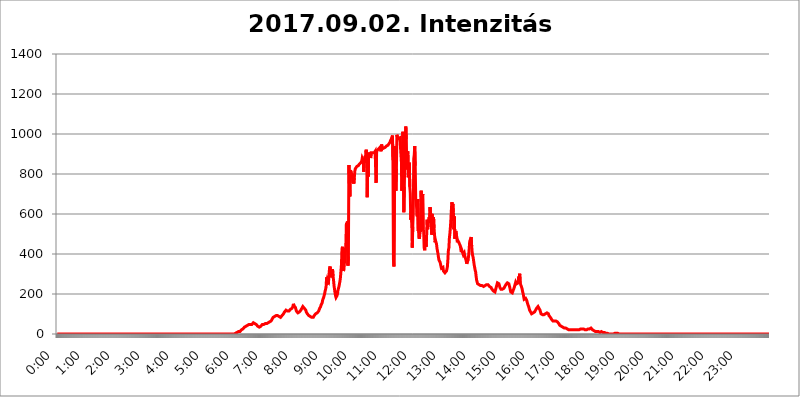
| Category | 2017.09.02. Intenzitás [W/m^2] |
|---|---|
| 0.0 | 0 |
| 0.0006944444444444445 | 0 |
| 0.001388888888888889 | 0 |
| 0.0020833333333333333 | 0 |
| 0.002777777777777778 | 0 |
| 0.003472222222222222 | 0 |
| 0.004166666666666667 | 0 |
| 0.004861111111111111 | 0 |
| 0.005555555555555556 | 0 |
| 0.0062499999999999995 | 0 |
| 0.006944444444444444 | 0 |
| 0.007638888888888889 | 0 |
| 0.008333333333333333 | 0 |
| 0.009027777777777779 | 0 |
| 0.009722222222222222 | 0 |
| 0.010416666666666666 | 0 |
| 0.011111111111111112 | 0 |
| 0.011805555555555555 | 0 |
| 0.012499999999999999 | 0 |
| 0.013194444444444444 | 0 |
| 0.013888888888888888 | 0 |
| 0.014583333333333332 | 0 |
| 0.015277777777777777 | 0 |
| 0.015972222222222224 | 0 |
| 0.016666666666666666 | 0 |
| 0.017361111111111112 | 0 |
| 0.018055555555555557 | 0 |
| 0.01875 | 0 |
| 0.019444444444444445 | 0 |
| 0.02013888888888889 | 0 |
| 0.020833333333333332 | 0 |
| 0.02152777777777778 | 0 |
| 0.022222222222222223 | 0 |
| 0.02291666666666667 | 0 |
| 0.02361111111111111 | 0 |
| 0.024305555555555556 | 0 |
| 0.024999999999999998 | 0 |
| 0.025694444444444447 | 0 |
| 0.02638888888888889 | 0 |
| 0.027083333333333334 | 0 |
| 0.027777777777777776 | 0 |
| 0.02847222222222222 | 0 |
| 0.029166666666666664 | 0 |
| 0.029861111111111113 | 0 |
| 0.030555555555555555 | 0 |
| 0.03125 | 0 |
| 0.03194444444444445 | 0 |
| 0.03263888888888889 | 0 |
| 0.03333333333333333 | 0 |
| 0.034027777777777775 | 0 |
| 0.034722222222222224 | 0 |
| 0.035416666666666666 | 0 |
| 0.036111111111111115 | 0 |
| 0.03680555555555556 | 0 |
| 0.0375 | 0 |
| 0.03819444444444444 | 0 |
| 0.03888888888888889 | 0 |
| 0.03958333333333333 | 0 |
| 0.04027777777777778 | 0 |
| 0.04097222222222222 | 0 |
| 0.041666666666666664 | 0 |
| 0.042361111111111106 | 0 |
| 0.04305555555555556 | 0 |
| 0.043750000000000004 | 0 |
| 0.044444444444444446 | 0 |
| 0.04513888888888889 | 0 |
| 0.04583333333333334 | 0 |
| 0.04652777777777778 | 0 |
| 0.04722222222222222 | 0 |
| 0.04791666666666666 | 0 |
| 0.04861111111111111 | 0 |
| 0.049305555555555554 | 0 |
| 0.049999999999999996 | 0 |
| 0.05069444444444445 | 0 |
| 0.051388888888888894 | 0 |
| 0.052083333333333336 | 0 |
| 0.05277777777777778 | 0 |
| 0.05347222222222222 | 0 |
| 0.05416666666666667 | 0 |
| 0.05486111111111111 | 0 |
| 0.05555555555555555 | 0 |
| 0.05625 | 0 |
| 0.05694444444444444 | 0 |
| 0.057638888888888885 | 0 |
| 0.05833333333333333 | 0 |
| 0.05902777777777778 | 0 |
| 0.059722222222222225 | 0 |
| 0.06041666666666667 | 0 |
| 0.061111111111111116 | 0 |
| 0.06180555555555556 | 0 |
| 0.0625 | 0 |
| 0.06319444444444444 | 0 |
| 0.06388888888888888 | 0 |
| 0.06458333333333334 | 0 |
| 0.06527777777777778 | 0 |
| 0.06597222222222222 | 0 |
| 0.06666666666666667 | 0 |
| 0.06736111111111111 | 0 |
| 0.06805555555555555 | 0 |
| 0.06874999999999999 | 0 |
| 0.06944444444444443 | 0 |
| 0.07013888888888889 | 0 |
| 0.07083333333333333 | 0 |
| 0.07152777777777779 | 0 |
| 0.07222222222222223 | 0 |
| 0.07291666666666667 | 0 |
| 0.07361111111111111 | 0 |
| 0.07430555555555556 | 0 |
| 0.075 | 0 |
| 0.07569444444444444 | 0 |
| 0.0763888888888889 | 0 |
| 0.07708333333333334 | 0 |
| 0.07777777777777778 | 0 |
| 0.07847222222222222 | 0 |
| 0.07916666666666666 | 0 |
| 0.0798611111111111 | 0 |
| 0.08055555555555556 | 0 |
| 0.08125 | 0 |
| 0.08194444444444444 | 0 |
| 0.08263888888888889 | 0 |
| 0.08333333333333333 | 0 |
| 0.08402777777777777 | 0 |
| 0.08472222222222221 | 0 |
| 0.08541666666666665 | 0 |
| 0.08611111111111112 | 0 |
| 0.08680555555555557 | 0 |
| 0.08750000000000001 | 0 |
| 0.08819444444444445 | 0 |
| 0.08888888888888889 | 0 |
| 0.08958333333333333 | 0 |
| 0.09027777777777778 | 0 |
| 0.09097222222222222 | 0 |
| 0.09166666666666667 | 0 |
| 0.09236111111111112 | 0 |
| 0.09305555555555556 | 0 |
| 0.09375 | 0 |
| 0.09444444444444444 | 0 |
| 0.09513888888888888 | 0 |
| 0.09583333333333333 | 0 |
| 0.09652777777777777 | 0 |
| 0.09722222222222222 | 0 |
| 0.09791666666666667 | 0 |
| 0.09861111111111111 | 0 |
| 0.09930555555555555 | 0 |
| 0.09999999999999999 | 0 |
| 0.10069444444444443 | 0 |
| 0.1013888888888889 | 0 |
| 0.10208333333333335 | 0 |
| 0.10277777777777779 | 0 |
| 0.10347222222222223 | 0 |
| 0.10416666666666667 | 0 |
| 0.10486111111111111 | 0 |
| 0.10555555555555556 | 0 |
| 0.10625 | 0 |
| 0.10694444444444444 | 0 |
| 0.1076388888888889 | 0 |
| 0.10833333333333334 | 0 |
| 0.10902777777777778 | 0 |
| 0.10972222222222222 | 0 |
| 0.1111111111111111 | 0 |
| 0.11180555555555556 | 0 |
| 0.11180555555555556 | 0 |
| 0.1125 | 0 |
| 0.11319444444444444 | 0 |
| 0.11388888888888889 | 0 |
| 0.11458333333333333 | 0 |
| 0.11527777777777777 | 0 |
| 0.11597222222222221 | 0 |
| 0.11666666666666665 | 0 |
| 0.1173611111111111 | 0 |
| 0.11805555555555557 | 0 |
| 0.11944444444444445 | 0 |
| 0.12013888888888889 | 0 |
| 0.12083333333333333 | 0 |
| 0.12152777777777778 | 0 |
| 0.12222222222222223 | 0 |
| 0.12291666666666667 | 0 |
| 0.12291666666666667 | 0 |
| 0.12361111111111112 | 0 |
| 0.12430555555555556 | 0 |
| 0.125 | 0 |
| 0.12569444444444444 | 0 |
| 0.12638888888888888 | 0 |
| 0.12708333333333333 | 0 |
| 0.16875 | 0 |
| 0.12847222222222224 | 0 |
| 0.12916666666666668 | 0 |
| 0.12986111111111112 | 0 |
| 0.13055555555555556 | 0 |
| 0.13125 | 0 |
| 0.13194444444444445 | 0 |
| 0.1326388888888889 | 0 |
| 0.13333333333333333 | 0 |
| 0.13402777777777777 | 0 |
| 0.13402777777777777 | 0 |
| 0.13472222222222222 | 0 |
| 0.13541666666666666 | 0 |
| 0.1361111111111111 | 0 |
| 0.13749999999999998 | 0 |
| 0.13819444444444443 | 0 |
| 0.1388888888888889 | 0 |
| 0.13958333333333334 | 0 |
| 0.14027777777777778 | 0 |
| 0.14097222222222222 | 0 |
| 0.14166666666666666 | 0 |
| 0.1423611111111111 | 0 |
| 0.14305555555555557 | 0 |
| 0.14375000000000002 | 0 |
| 0.14444444444444446 | 0 |
| 0.1451388888888889 | 0 |
| 0.1451388888888889 | 0 |
| 0.14652777777777778 | 0 |
| 0.14722222222222223 | 0 |
| 0.14791666666666667 | 0 |
| 0.1486111111111111 | 0 |
| 0.14930555555555555 | 0 |
| 0.15 | 0 |
| 0.15069444444444444 | 0 |
| 0.15138888888888888 | 0 |
| 0.15208333333333332 | 0 |
| 0.15277777777777776 | 0 |
| 0.15347222222222223 | 0 |
| 0.15416666666666667 | 0 |
| 0.15486111111111112 | 0 |
| 0.15555555555555556 | 0 |
| 0.15625 | 0 |
| 0.15694444444444444 | 0 |
| 0.15763888888888888 | 0 |
| 0.15833333333333333 | 0 |
| 0.15902777777777777 | 0 |
| 0.15972222222222224 | 0 |
| 0.16041666666666668 | 0 |
| 0.16111111111111112 | 0 |
| 0.16180555555555556 | 0 |
| 0.1625 | 0 |
| 0.16319444444444445 | 0 |
| 0.1638888888888889 | 0 |
| 0.16458333333333333 | 0 |
| 0.16527777777777777 | 0 |
| 0.16597222222222222 | 0 |
| 0.16666666666666666 | 0 |
| 0.1673611111111111 | 0 |
| 0.16805555555555554 | 0 |
| 0.16874999999999998 | 0 |
| 0.16944444444444443 | 0 |
| 0.17013888888888887 | 0 |
| 0.1708333333333333 | 0 |
| 0.17152777777777775 | 0 |
| 0.17222222222222225 | 0 |
| 0.1729166666666667 | 0 |
| 0.17361111111111113 | 0 |
| 0.17430555555555557 | 0 |
| 0.17500000000000002 | 0 |
| 0.17569444444444446 | 0 |
| 0.1763888888888889 | 0 |
| 0.17708333333333334 | 0 |
| 0.17777777777777778 | 0 |
| 0.17847222222222223 | 0 |
| 0.17916666666666667 | 0 |
| 0.1798611111111111 | 0 |
| 0.18055555555555555 | 0 |
| 0.18125 | 0 |
| 0.18194444444444444 | 0 |
| 0.1826388888888889 | 0 |
| 0.18333333333333335 | 0 |
| 0.1840277777777778 | 0 |
| 0.18472222222222223 | 0 |
| 0.18541666666666667 | 0 |
| 0.18611111111111112 | 0 |
| 0.18680555555555556 | 0 |
| 0.1875 | 0 |
| 0.18819444444444444 | 0 |
| 0.18888888888888888 | 0 |
| 0.18958333333333333 | 0 |
| 0.19027777777777777 | 0 |
| 0.1909722222222222 | 0 |
| 0.19166666666666665 | 0 |
| 0.19236111111111112 | 0 |
| 0.19305555555555554 | 0 |
| 0.19375 | 0 |
| 0.19444444444444445 | 0 |
| 0.1951388888888889 | 0 |
| 0.19583333333333333 | 0 |
| 0.19652777777777777 | 0 |
| 0.19722222222222222 | 0 |
| 0.19791666666666666 | 0 |
| 0.1986111111111111 | 0 |
| 0.19930555555555554 | 0 |
| 0.19999999999999998 | 0 |
| 0.20069444444444443 | 0 |
| 0.20138888888888887 | 0 |
| 0.2020833333333333 | 0 |
| 0.2027777777777778 | 0 |
| 0.2034722222222222 | 0 |
| 0.2041666666666667 | 0 |
| 0.20486111111111113 | 0 |
| 0.20555555555555557 | 0 |
| 0.20625000000000002 | 0 |
| 0.20694444444444446 | 0 |
| 0.2076388888888889 | 0 |
| 0.20833333333333334 | 0 |
| 0.20902777777777778 | 0 |
| 0.20972222222222223 | 0 |
| 0.21041666666666667 | 0 |
| 0.2111111111111111 | 0 |
| 0.21180555555555555 | 0 |
| 0.2125 | 0 |
| 0.21319444444444444 | 0 |
| 0.2138888888888889 | 0 |
| 0.21458333333333335 | 0 |
| 0.2152777777777778 | 0 |
| 0.21597222222222223 | 0 |
| 0.21666666666666667 | 0 |
| 0.21736111111111112 | 0 |
| 0.21805555555555556 | 0 |
| 0.21875 | 0 |
| 0.21944444444444444 | 0 |
| 0.22013888888888888 | 0 |
| 0.22083333333333333 | 0 |
| 0.22152777777777777 | 0 |
| 0.2222222222222222 | 0 |
| 0.22291666666666665 | 0 |
| 0.2236111111111111 | 0 |
| 0.22430555555555556 | 0 |
| 0.225 | 0 |
| 0.22569444444444445 | 0 |
| 0.2263888888888889 | 0 |
| 0.22708333333333333 | 0 |
| 0.22777777777777777 | 0 |
| 0.22847222222222222 | 0 |
| 0.22916666666666666 | 0 |
| 0.2298611111111111 | 0 |
| 0.23055555555555554 | 0 |
| 0.23124999999999998 | 0 |
| 0.23194444444444443 | 0 |
| 0.23263888888888887 | 0 |
| 0.2333333333333333 | 0 |
| 0.2340277777777778 | 0 |
| 0.2347222222222222 | 0 |
| 0.2354166666666667 | 0 |
| 0.23611111111111113 | 0 |
| 0.23680555555555557 | 0 |
| 0.23750000000000002 | 0 |
| 0.23819444444444446 | 0 |
| 0.2388888888888889 | 0 |
| 0.23958333333333334 | 0 |
| 0.24027777777777778 | 0 |
| 0.24097222222222223 | 0 |
| 0.24166666666666667 | 0 |
| 0.2423611111111111 | 0 |
| 0.24305555555555555 | 0 |
| 0.24375 | 0 |
| 0.24444444444444446 | 0 |
| 0.24513888888888888 | 0 |
| 0.24583333333333335 | 0 |
| 0.2465277777777778 | 0 |
| 0.24722222222222223 | 0 |
| 0.24791666666666667 | 0 |
| 0.24861111111111112 | 3.525 |
| 0.24930555555555556 | 3.525 |
| 0.25 | 3.525 |
| 0.25069444444444444 | 3.525 |
| 0.2513888888888889 | 3.525 |
| 0.2520833333333333 | 7.887 |
| 0.25277777777777777 | 7.887 |
| 0.2534722222222222 | 7.887 |
| 0.25416666666666665 | 12.257 |
| 0.2548611111111111 | 12.257 |
| 0.2555555555555556 | 12.257 |
| 0.25625000000000003 | 12.257 |
| 0.2569444444444445 | 16.636 |
| 0.2576388888888889 | 16.636 |
| 0.25833333333333336 | 21.024 |
| 0.2590277777777778 | 21.024 |
| 0.25972222222222224 | 25.419 |
| 0.2604166666666667 | 25.419 |
| 0.2611111111111111 | 29.823 |
| 0.26180555555555557 | 29.823 |
| 0.2625 | 34.234 |
| 0.26319444444444445 | 34.234 |
| 0.2638888888888889 | 38.653 |
| 0.26458333333333334 | 38.653 |
| 0.2652777777777778 | 38.653 |
| 0.2659722222222222 | 43.079 |
| 0.26666666666666666 | 43.079 |
| 0.2673611111111111 | 43.079 |
| 0.26805555555555555 | 47.511 |
| 0.26875 | 47.511 |
| 0.26944444444444443 | 47.511 |
| 0.2701388888888889 | 47.511 |
| 0.2708333333333333 | 47.511 |
| 0.27152777777777776 | 47.511 |
| 0.2722222222222222 | 47.511 |
| 0.27291666666666664 | 47.511 |
| 0.2736111111111111 | 51.951 |
| 0.2743055555555555 | 51.951 |
| 0.27499999999999997 | 56.398 |
| 0.27569444444444446 | 51.951 |
| 0.27638888888888885 | 56.398 |
| 0.27708333333333335 | 51.951 |
| 0.2777777777777778 | 51.951 |
| 0.27847222222222223 | 51.951 |
| 0.2791666666666667 | 47.511 |
| 0.2798611111111111 | 43.079 |
| 0.28055555555555556 | 43.079 |
| 0.28125 | 38.653 |
| 0.28194444444444444 | 38.653 |
| 0.2826388888888889 | 38.653 |
| 0.2833333333333333 | 34.234 |
| 0.28402777777777777 | 34.234 |
| 0.2847222222222222 | 38.653 |
| 0.28541666666666665 | 38.653 |
| 0.28611111111111115 | 43.079 |
| 0.28680555555555554 | 43.079 |
| 0.28750000000000003 | 47.511 |
| 0.2881944444444445 | 47.511 |
| 0.2888888888888889 | 47.511 |
| 0.28958333333333336 | 47.511 |
| 0.2902777777777778 | 47.511 |
| 0.29097222222222224 | 51.951 |
| 0.2916666666666667 | 51.951 |
| 0.2923611111111111 | 51.951 |
| 0.29305555555555557 | 56.398 |
| 0.29375 | 51.951 |
| 0.29444444444444445 | 56.398 |
| 0.2951388888888889 | 56.398 |
| 0.29583333333333334 | 56.398 |
| 0.2965277777777778 | 56.398 |
| 0.2972222222222222 | 56.398 |
| 0.29791666666666666 | 60.85 |
| 0.2986111111111111 | 60.85 |
| 0.29930555555555555 | 65.31 |
| 0.3 | 65.31 |
| 0.30069444444444443 | 69.775 |
| 0.3013888888888889 | 74.246 |
| 0.3020833333333333 | 78.722 |
| 0.30277777777777776 | 83.205 |
| 0.3034722222222222 | 83.205 |
| 0.30416666666666664 | 87.692 |
| 0.3048611111111111 | 87.692 |
| 0.3055555555555555 | 92.184 |
| 0.30624999999999997 | 92.184 |
| 0.3069444444444444 | 92.184 |
| 0.3076388888888889 | 92.184 |
| 0.30833333333333335 | 92.184 |
| 0.3090277777777778 | 92.184 |
| 0.30972222222222223 | 92.184 |
| 0.3104166666666667 | 92.184 |
| 0.3111111111111111 | 87.692 |
| 0.31180555555555556 | 83.205 |
| 0.3125 | 83.205 |
| 0.31319444444444444 | 83.205 |
| 0.3138888888888889 | 87.692 |
| 0.3145833333333333 | 87.692 |
| 0.31527777777777777 | 92.184 |
| 0.3159722222222222 | 92.184 |
| 0.31666666666666665 | 96.682 |
| 0.31736111111111115 | 101.184 |
| 0.31805555555555554 | 105.69 |
| 0.31875000000000003 | 110.201 |
| 0.3194444444444445 | 110.201 |
| 0.3201388888888889 | 114.716 |
| 0.32083333333333336 | 119.235 |
| 0.3215277777777778 | 114.716 |
| 0.32222222222222224 | 114.716 |
| 0.3229166666666667 | 114.716 |
| 0.3236111111111111 | 114.716 |
| 0.32430555555555557 | 114.716 |
| 0.325 | 114.716 |
| 0.32569444444444445 | 119.235 |
| 0.3263888888888889 | 119.235 |
| 0.32708333333333334 | 123.758 |
| 0.3277777777777778 | 123.758 |
| 0.3284722222222222 | 123.758 |
| 0.32916666666666666 | 128.284 |
| 0.3298611111111111 | 128.284 |
| 0.33055555555555555 | 137.347 |
| 0.33125 | 150.964 |
| 0.33194444444444443 | 141.884 |
| 0.3326388888888889 | 137.347 |
| 0.3333333333333333 | 137.347 |
| 0.3340277777777778 | 132.814 |
| 0.3347222222222222 | 123.758 |
| 0.3354166666666667 | 114.716 |
| 0.3361111111111111 | 110.201 |
| 0.3368055555555556 | 110.201 |
| 0.33749999999999997 | 105.69 |
| 0.33819444444444446 | 110.201 |
| 0.33888888888888885 | 110.201 |
| 0.33958333333333335 | 110.201 |
| 0.34027777777777773 | 114.716 |
| 0.34097222222222223 | 114.716 |
| 0.3416666666666666 | 119.235 |
| 0.3423611111111111 | 123.758 |
| 0.3430555555555555 | 128.284 |
| 0.34375 | 132.814 |
| 0.3444444444444445 | 137.347 |
| 0.3451388888888889 | 141.884 |
| 0.3458333333333334 | 141.884 |
| 0.34652777777777777 | 128.284 |
| 0.34722222222222227 | 123.758 |
| 0.34791666666666665 | 128.284 |
| 0.34861111111111115 | 119.235 |
| 0.34930555555555554 | 110.201 |
| 0.35000000000000003 | 105.69 |
| 0.3506944444444444 | 101.184 |
| 0.3513888888888889 | 101.184 |
| 0.3520833333333333 | 96.682 |
| 0.3527777777777778 | 92.184 |
| 0.3534722222222222 | 92.184 |
| 0.3541666666666667 | 92.184 |
| 0.3548611111111111 | 87.692 |
| 0.35555555555555557 | 83.205 |
| 0.35625 | 83.205 |
| 0.35694444444444445 | 83.205 |
| 0.3576388888888889 | 78.722 |
| 0.35833333333333334 | 83.205 |
| 0.3590277777777778 | 83.205 |
| 0.3597222222222222 | 87.692 |
| 0.36041666666666666 | 92.184 |
| 0.3611111111111111 | 92.184 |
| 0.36180555555555555 | 96.682 |
| 0.3625 | 101.184 |
| 0.36319444444444443 | 101.184 |
| 0.3638888888888889 | 105.69 |
| 0.3645833333333333 | 105.69 |
| 0.3652777777777778 | 105.69 |
| 0.3659722222222222 | 110.201 |
| 0.3666666666666667 | 114.716 |
| 0.3673611111111111 | 119.235 |
| 0.3680555555555556 | 128.284 |
| 0.36874999999999997 | 132.814 |
| 0.36944444444444446 | 137.347 |
| 0.37013888888888885 | 146.423 |
| 0.37083333333333335 | 150.964 |
| 0.37152777777777773 | 155.509 |
| 0.37222222222222223 | 169.156 |
| 0.3729166666666666 | 173.709 |
| 0.3736111111111111 | 182.82 |
| 0.3743055555555555 | 191.937 |
| 0.375 | 201.058 |
| 0.3756944444444445 | 214.746 |
| 0.3763888888888889 | 223.873 |
| 0.3770833333333334 | 237.564 |
| 0.37777777777777777 | 283.156 |
| 0.37847222222222227 | 246.689 |
| 0.37916666666666665 | 274.047 |
| 0.37986111111111115 | 274.047 |
| 0.38055555555555554 | 264.932 |
| 0.38125000000000003 | 301.354 |
| 0.3819444444444444 | 328.584 |
| 0.3826388888888889 | 337.639 |
| 0.3833333333333333 | 310.44 |
| 0.3840277777777778 | 283.156 |
| 0.3847222222222222 | 283.156 |
| 0.3854166666666667 | 278.603 |
| 0.3861111111111111 | 324.052 |
| 0.38680555555555557 | 287.709 |
| 0.3875 | 269.49 |
| 0.38819444444444445 | 242.127 |
| 0.3888888888888889 | 223.873 |
| 0.38958333333333334 | 205.62 |
| 0.3902777777777778 | 191.937 |
| 0.3909722222222222 | 182.82 |
| 0.39166666666666666 | 182.82 |
| 0.3923611111111111 | 191.937 |
| 0.39305555555555555 | 201.058 |
| 0.39375 | 219.309 |
| 0.39444444444444443 | 228.436 |
| 0.3951388888888889 | 237.564 |
| 0.3958333333333333 | 251.251 |
| 0.3965277777777778 | 264.932 |
| 0.3972222222222222 | 283.156 |
| 0.3979166666666667 | 314.98 |
| 0.3986111111111111 | 346.682 |
| 0.3993055555555556 | 422.943 |
| 0.39999999999999997 | 436.27 |
| 0.40069444444444446 | 360.221 |
| 0.40138888888888885 | 314.98 |
| 0.40208333333333335 | 324.052 |
| 0.40277777777777773 | 355.712 |
| 0.40347222222222223 | 387.202 |
| 0.4041666666666666 | 414.035 |
| 0.4048611111111111 | 458.38 |
| 0.4055555555555555 | 553.986 |
| 0.40625 | 497.836 |
| 0.4069444444444445 | 562.53 |
| 0.4076388888888889 | 342.162 |
| 0.4083333333333334 | 387.202 |
| 0.40902777777777777 | 845.365 |
| 0.40972222222222227 | 751.803 |
| 0.41041666666666665 | 687.544 |
| 0.41111111111111115 | 818.392 |
| 0.41180555555555554 | 814.519 |
| 0.41250000000000003 | 806.757 |
| 0.4131944444444444 | 806.757 |
| 0.4138888888888889 | 791.169 |
| 0.4145833333333333 | 767.62 |
| 0.4152777777777778 | 759.723 |
| 0.4159722222222222 | 751.803 |
| 0.4166666666666667 | 783.342 |
| 0.4173611111111111 | 814.519 |
| 0.41805555555555557 | 826.123 |
| 0.41875 | 826.123 |
| 0.41944444444444445 | 829.981 |
| 0.4201388888888889 | 837.682 |
| 0.42083333333333334 | 837.682 |
| 0.4215277777777778 | 841.526 |
| 0.4222222222222222 | 841.526 |
| 0.42291666666666666 | 845.365 |
| 0.4236111111111111 | 849.199 |
| 0.42430555555555555 | 849.199 |
| 0.425 | 853.029 |
| 0.42569444444444443 | 856.855 |
| 0.4263888888888889 | 860.676 |
| 0.4270833333333333 | 864.493 |
| 0.4277777777777778 | 879.719 |
| 0.4284722222222222 | 883.516 |
| 0.4291666666666667 | 868.305 |
| 0.4298611111111111 | 810.641 |
| 0.4305555555555556 | 875.918 |
| 0.43124999999999997 | 856.855 |
| 0.43194444444444446 | 891.099 |
| 0.43263888888888885 | 879.719 |
| 0.43333333333333335 | 921.298 |
| 0.43402777777777773 | 887.309 |
| 0.43472222222222223 | 683.473 |
| 0.4354166666666666 | 853.029 |
| 0.4361111111111111 | 787.258 |
| 0.4368055555555555 | 906.223 |
| 0.4375 | 894.885 |
| 0.4381944444444445 | 906.223 |
| 0.4388888888888889 | 894.885 |
| 0.4395833333333334 | 879.719 |
| 0.44027777777777777 | 906.223 |
| 0.44097222222222227 | 906.223 |
| 0.44166666666666665 | 902.447 |
| 0.44236111111111115 | 906.223 |
| 0.44305555555555554 | 902.447 |
| 0.44375000000000003 | 906.223 |
| 0.4444444444444444 | 906.223 |
| 0.4451388888888889 | 909.996 |
| 0.4458333333333333 | 913.766 |
| 0.4465277777777778 | 913.766 |
| 0.4472222222222222 | 755.766 |
| 0.4479166666666667 | 909.996 |
| 0.4486111111111111 | 917.534 |
| 0.44930555555555557 | 917.534 |
| 0.45 | 921.298 |
| 0.45069444444444445 | 925.06 |
| 0.4513888888888889 | 925.06 |
| 0.45208333333333334 | 925.06 |
| 0.4527777777777778 | 932.576 |
| 0.4534722222222222 | 940.082 |
| 0.45416666666666666 | 913.766 |
| 0.4548611111111111 | 947.58 |
| 0.45555555555555555 | 936.33 |
| 0.45625 | 932.576 |
| 0.45694444444444443 | 932.576 |
| 0.4576388888888889 | 928.819 |
| 0.4583333333333333 | 932.576 |
| 0.4590277777777778 | 932.576 |
| 0.4597222222222222 | 932.576 |
| 0.4604166666666667 | 936.33 |
| 0.4611111111111111 | 936.33 |
| 0.4618055555555556 | 940.082 |
| 0.46249999999999997 | 940.082 |
| 0.46319444444444446 | 940.082 |
| 0.46388888888888885 | 943.832 |
| 0.46458333333333335 | 947.58 |
| 0.46527777777777773 | 951.327 |
| 0.46597222222222223 | 955.071 |
| 0.4666666666666666 | 958.814 |
| 0.4673611111111111 | 966.295 |
| 0.4680555555555555 | 970.034 |
| 0.46875 | 977.508 |
| 0.4694444444444445 | 981.244 |
| 0.4701388888888889 | 992.448 |
| 0.4708333333333334 | 868.305 |
| 0.47152777777777777 | 369.23 |
| 0.47222222222222227 | 337.639 |
| 0.47291666666666665 | 731.896 |
| 0.47361111111111115 | 940.082 |
| 0.47430555555555554 | 902.447 |
| 0.47500000000000003 | 715.858 |
| 0.4756944444444444 | 826.123 |
| 0.4763888888888889 | 996.182 |
| 0.4770833333333333 | 984.98 |
| 0.4777777777777778 | 981.244 |
| 0.4784722222222222 | 977.508 |
| 0.4791666666666667 | 981.244 |
| 0.4798611111111111 | 981.244 |
| 0.48055555555555557 | 981.244 |
| 0.48125 | 984.98 |
| 0.48194444444444445 | 981.244 |
| 0.4826388888888889 | 864.493 |
| 0.48333333333333334 | 715.858 |
| 0.4840277777777778 | 887.309 |
| 0.4847222222222222 | 1011.118 |
| 0.48541666666666666 | 771.559 |
| 0.4861111111111111 | 609.062 |
| 0.48680555555555555 | 735.89 |
| 0.4875 | 891.099 |
| 0.48819444444444443 | 984.98 |
| 0.4888888888888889 | 1037.277 |
| 0.4895833333333333 | 973.772 |
| 0.4902777777777778 | 822.26 |
| 0.4909722222222222 | 872.114 |
| 0.4916666666666667 | 913.766 |
| 0.4923611111111111 | 783.342 |
| 0.4930555555555556 | 806.757 |
| 0.49374999999999997 | 856.855 |
| 0.49444444444444446 | 735.89 |
| 0.49513888888888885 | 703.762 |
| 0.49583333333333335 | 571.049 |
| 0.49652777777777773 | 613.252 |
| 0.49722222222222223 | 558.261 |
| 0.4979166666666666 | 431.833 |
| 0.4986111111111111 | 536.82 |
| 0.4993055555555555 | 604.864 |
| 0.5 | 875.918 |
| 0.5006944444444444 | 894.885 |
| 0.5013888888888889 | 940.082 |
| 0.5020833333333333 | 841.526 |
| 0.5027777777777778 | 675.311 |
| 0.5034722222222222 | 667.123 |
| 0.5041666666666667 | 621.613 |
| 0.5048611111111111 | 588.009 |
| 0.5055555555555555 | 675.311 |
| 0.50625 | 515.223 |
| 0.5069444444444444 | 523.88 |
| 0.5076388888888889 | 475.972 |
| 0.5083333333333333 | 489.108 |
| 0.5090277777777777 | 519.555 |
| 0.5097222222222222 | 510.885 |
| 0.5104166666666666 | 715.858 |
| 0.5111111111111112 | 642.4 |
| 0.5118055555555555 | 629.948 |
| 0.5125000000000001 | 699.717 |
| 0.5131944444444444 | 523.88 |
| 0.513888888888889 | 515.223 |
| 0.5145833333333333 | 431.833 |
| 0.5152777777777778 | 418.492 |
| 0.5159722222222222 | 453.968 |
| 0.5166666666666667 | 449.551 |
| 0.517361111111111 | 436.27 |
| 0.5180555555555556 | 493.475 |
| 0.5187499999999999 | 571.049 |
| 0.5194444444444445 | 523.88 |
| 0.5201388888888888 | 545.416 |
| 0.5208333333333334 | 562.53 |
| 0.5215277777777778 | 583.779 |
| 0.5222222222222223 | 562.53 |
| 0.5229166666666667 | 634.105 |
| 0.5236111111111111 | 600.661 |
| 0.5243055555555556 | 592.233 |
| 0.525 | 497.836 |
| 0.5256944444444445 | 600.661 |
| 0.5263888888888889 | 497.836 |
| 0.5270833333333333 | 523.88 |
| 0.5277777777777778 | 583.779 |
| 0.5284722222222222 | 528.2 |
| 0.5291666666666667 | 497.836 |
| 0.5298611111111111 | 458.38 |
| 0.5305555555555556 | 467.187 |
| 0.53125 | 471.582 |
| 0.5319444444444444 | 449.551 |
| 0.5326388888888889 | 427.39 |
| 0.5333333333333333 | 414.035 |
| 0.5340277777777778 | 400.638 |
| 0.5347222222222222 | 382.715 |
| 0.5354166666666667 | 369.23 |
| 0.5361111111111111 | 364.728 |
| 0.5368055555555555 | 360.221 |
| 0.5375 | 351.198 |
| 0.5381944444444444 | 337.639 |
| 0.5388888888888889 | 328.584 |
| 0.5395833333333333 | 333.113 |
| 0.5402777777777777 | 328.584 |
| 0.5409722222222222 | 333.113 |
| 0.5416666666666666 | 314.98 |
| 0.5423611111111112 | 310.44 |
| 0.5430555555555555 | 310.44 |
| 0.5437500000000001 | 305.898 |
| 0.5444444444444444 | 305.898 |
| 0.545138888888889 | 310.44 |
| 0.5458333333333333 | 314.98 |
| 0.5465277777777778 | 324.052 |
| 0.5472222222222222 | 337.639 |
| 0.5479166666666667 | 373.729 |
| 0.548611111111111 | 418.492 |
| 0.5493055555555556 | 431.833 |
| 0.5499999999999999 | 480.356 |
| 0.5506944444444445 | 502.192 |
| 0.5513888888888888 | 532.513 |
| 0.5520833333333334 | 571.049 |
| 0.5527777777777778 | 621.613 |
| 0.5534722222222223 | 658.909 |
| 0.5541666666666667 | 642.4 |
| 0.5548611111111111 | 650.667 |
| 0.5555555555555556 | 609.062 |
| 0.55625 | 523.88 |
| 0.5569444444444445 | 588.009 |
| 0.5576388888888889 | 475.972 |
| 0.5583333333333333 | 484.735 |
| 0.5590277777777778 | 515.223 |
| 0.5597222222222222 | 519.555 |
| 0.5604166666666667 | 480.356 |
| 0.5611111111111111 | 458.38 |
| 0.5618055555555556 | 467.187 |
| 0.5625 | 462.786 |
| 0.5631944444444444 | 458.38 |
| 0.5638888888888889 | 458.38 |
| 0.5645833333333333 | 458.38 |
| 0.5652777777777778 | 440.702 |
| 0.5659722222222222 | 440.702 |
| 0.5666666666666667 | 409.574 |
| 0.5673611111111111 | 418.492 |
| 0.5680555555555555 | 418.492 |
| 0.56875 | 414.035 |
| 0.5694444444444444 | 396.164 |
| 0.5701388888888889 | 396.164 |
| 0.5708333333333333 | 405.108 |
| 0.5715277777777777 | 391.685 |
| 0.5722222222222222 | 382.715 |
| 0.5729166666666666 | 378.224 |
| 0.5736111111111112 | 364.728 |
| 0.5743055555555555 | 351.198 |
| 0.5750000000000001 | 351.198 |
| 0.5756944444444444 | 355.712 |
| 0.576388888888889 | 373.729 |
| 0.5770833333333333 | 396.164 |
| 0.5777777777777778 | 427.39 |
| 0.5784722222222222 | 462.786 |
| 0.5791666666666667 | 462.786 |
| 0.579861111111111 | 458.38 |
| 0.5805555555555556 | 484.735 |
| 0.5812499999999999 | 440.702 |
| 0.5819444444444445 | 409.574 |
| 0.5826388888888888 | 391.685 |
| 0.5833333333333334 | 382.715 |
| 0.5840277777777778 | 378.224 |
| 0.5847222222222223 | 346.682 |
| 0.5854166666666667 | 333.113 |
| 0.5861111111111111 | 319.517 |
| 0.5868055555555556 | 310.44 |
| 0.5875 | 287.709 |
| 0.5881944444444445 | 269.49 |
| 0.5888888888888889 | 260.373 |
| 0.5895833333333333 | 251.251 |
| 0.5902777777777778 | 246.689 |
| 0.5909722222222222 | 246.689 |
| 0.5916666666666667 | 246.689 |
| 0.5923611111111111 | 246.689 |
| 0.5930555555555556 | 246.689 |
| 0.59375 | 242.127 |
| 0.5944444444444444 | 242.127 |
| 0.5951388888888889 | 242.127 |
| 0.5958333333333333 | 242.127 |
| 0.5965277777777778 | 237.564 |
| 0.5972222222222222 | 237.564 |
| 0.5979166666666667 | 237.564 |
| 0.5986111111111111 | 237.564 |
| 0.5993055555555555 | 237.564 |
| 0.6 | 242.127 |
| 0.6006944444444444 | 246.689 |
| 0.6013888888888889 | 246.689 |
| 0.6020833333333333 | 246.689 |
| 0.6027777777777777 | 246.689 |
| 0.6034722222222222 | 246.689 |
| 0.6041666666666666 | 246.689 |
| 0.6048611111111112 | 246.689 |
| 0.6055555555555555 | 242.127 |
| 0.6062500000000001 | 237.564 |
| 0.6069444444444444 | 237.564 |
| 0.607638888888889 | 233 |
| 0.6083333333333333 | 233 |
| 0.6090277777777778 | 228.436 |
| 0.6097222222222222 | 223.873 |
| 0.6104166666666667 | 219.309 |
| 0.611111111111111 | 219.309 |
| 0.6118055555555556 | 214.746 |
| 0.6124999999999999 | 210.182 |
| 0.6131944444444445 | 210.182 |
| 0.6138888888888888 | 210.182 |
| 0.6145833333333334 | 219.309 |
| 0.6152777777777778 | 228.436 |
| 0.6159722222222223 | 237.564 |
| 0.6166666666666667 | 242.127 |
| 0.6173611111111111 | 255.813 |
| 0.6180555555555556 | 260.373 |
| 0.61875 | 260.373 |
| 0.6194444444444445 | 251.251 |
| 0.6201388888888889 | 242.127 |
| 0.6208333333333333 | 233 |
| 0.6215277777777778 | 228.436 |
| 0.6222222222222222 | 223.873 |
| 0.6229166666666667 | 219.309 |
| 0.6236111111111111 | 219.309 |
| 0.6243055555555556 | 223.873 |
| 0.625 | 223.873 |
| 0.6256944444444444 | 228.436 |
| 0.6263888888888889 | 228.436 |
| 0.6270833333333333 | 233 |
| 0.6277777777777778 | 237.564 |
| 0.6284722222222222 | 242.127 |
| 0.6291666666666667 | 246.689 |
| 0.6298611111111111 | 251.251 |
| 0.6305555555555555 | 251.251 |
| 0.63125 | 255.813 |
| 0.6319444444444444 | 255.813 |
| 0.6326388888888889 | 255.813 |
| 0.6333333333333333 | 251.251 |
| 0.6340277777777777 | 242.127 |
| 0.6347222222222222 | 233 |
| 0.6354166666666666 | 219.309 |
| 0.6361111111111112 | 210.182 |
| 0.6368055555555555 | 205.62 |
| 0.6375000000000001 | 205.62 |
| 0.6381944444444444 | 205.62 |
| 0.638888888888889 | 210.182 |
| 0.6395833333333333 | 219.309 |
| 0.6402777777777778 | 223.873 |
| 0.6409722222222222 | 233 |
| 0.6416666666666667 | 242.127 |
| 0.642361111111111 | 251.251 |
| 0.6430555555555556 | 260.373 |
| 0.6437499999999999 | 260.373 |
| 0.6444444444444445 | 251.251 |
| 0.6451388888888888 | 246.689 |
| 0.6458333333333334 | 246.689 |
| 0.6465277777777778 | 255.813 |
| 0.6472222222222223 | 287.709 |
| 0.6479166666666667 | 278.603 |
| 0.6486111111111111 | 301.354 |
| 0.6493055555555556 | 255.813 |
| 0.65 | 246.689 |
| 0.6506944444444445 | 242.127 |
| 0.6513888888888889 | 233 |
| 0.6520833333333333 | 223.873 |
| 0.6527777777777778 | 210.182 |
| 0.6534722222222222 | 201.058 |
| 0.6541666666666667 | 187.378 |
| 0.6548611111111111 | 173.709 |
| 0.6555555555555556 | 173.709 |
| 0.65625 | 173.709 |
| 0.6569444444444444 | 178.264 |
| 0.6576388888888889 | 173.709 |
| 0.6583333333333333 | 169.156 |
| 0.6590277777777778 | 160.056 |
| 0.6597222222222222 | 150.964 |
| 0.6604166666666667 | 146.423 |
| 0.6611111111111111 | 137.347 |
| 0.6618055555555555 | 128.284 |
| 0.6625 | 119.235 |
| 0.6631944444444444 | 114.716 |
| 0.6638888888888889 | 110.201 |
| 0.6645833333333333 | 105.69 |
| 0.6652777777777777 | 101.184 |
| 0.6659722222222222 | 101.184 |
| 0.6666666666666666 | 105.69 |
| 0.6673611111111111 | 105.69 |
| 0.6680555555555556 | 110.201 |
| 0.6687500000000001 | 110.201 |
| 0.6694444444444444 | 110.201 |
| 0.6701388888888888 | 110.201 |
| 0.6708333333333334 | 119.235 |
| 0.6715277777777778 | 123.758 |
| 0.6722222222222222 | 128.284 |
| 0.6729166666666666 | 132.814 |
| 0.6736111111111112 | 132.814 |
| 0.6743055555555556 | 137.347 |
| 0.6749999999999999 | 132.814 |
| 0.6756944444444444 | 128.284 |
| 0.6763888888888889 | 123.758 |
| 0.6770833333333334 | 119.235 |
| 0.6777777777777777 | 110.201 |
| 0.6784722222222223 | 101.184 |
| 0.6791666666666667 | 101.184 |
| 0.6798611111111111 | 96.682 |
| 0.6805555555555555 | 96.682 |
| 0.68125 | 96.682 |
| 0.6819444444444445 | 96.682 |
| 0.6826388888888889 | 96.682 |
| 0.6833333333333332 | 96.682 |
| 0.6840277777777778 | 96.682 |
| 0.6847222222222222 | 101.184 |
| 0.6854166666666667 | 101.184 |
| 0.686111111111111 | 105.69 |
| 0.6868055555555556 | 105.69 |
| 0.6875 | 105.69 |
| 0.6881944444444444 | 101.184 |
| 0.688888888888889 | 101.184 |
| 0.6895833333333333 | 92.184 |
| 0.6902777777777778 | 92.184 |
| 0.6909722222222222 | 87.692 |
| 0.6916666666666668 | 83.205 |
| 0.6923611111111111 | 78.722 |
| 0.6930555555555555 | 74.246 |
| 0.69375 | 69.775 |
| 0.6944444444444445 | 69.775 |
| 0.6951388888888889 | 65.31 |
| 0.6958333333333333 | 65.31 |
| 0.6965277777777777 | 65.31 |
| 0.6972222222222223 | 65.31 |
| 0.6979166666666666 | 65.31 |
| 0.6986111111111111 | 65.31 |
| 0.6993055555555556 | 65.31 |
| 0.7000000000000001 | 65.31 |
| 0.7006944444444444 | 65.31 |
| 0.7013888888888888 | 60.85 |
| 0.7020833333333334 | 56.398 |
| 0.7027777777777778 | 56.398 |
| 0.7034722222222222 | 51.951 |
| 0.7041666666666666 | 47.511 |
| 0.7048611111111112 | 43.079 |
| 0.7055555555555556 | 38.653 |
| 0.7062499999999999 | 38.653 |
| 0.7069444444444444 | 38.653 |
| 0.7076388888888889 | 34.234 |
| 0.7083333333333334 | 34.234 |
| 0.7090277777777777 | 34.234 |
| 0.7097222222222223 | 34.234 |
| 0.7104166666666667 | 29.823 |
| 0.7111111111111111 | 29.823 |
| 0.7118055555555555 | 29.823 |
| 0.7125 | 29.823 |
| 0.7131944444444445 | 29.823 |
| 0.7138888888888889 | 25.419 |
| 0.7145833333333332 | 25.419 |
| 0.7152777777777778 | 25.419 |
| 0.7159722222222222 | 25.419 |
| 0.7166666666666667 | 21.024 |
| 0.717361111111111 | 21.024 |
| 0.7180555555555556 | 21.024 |
| 0.71875 | 21.024 |
| 0.7194444444444444 | 21.024 |
| 0.720138888888889 | 21.024 |
| 0.7208333333333333 | 21.024 |
| 0.7215277777777778 | 21.024 |
| 0.7222222222222222 | 21.024 |
| 0.7229166666666668 | 21.024 |
| 0.7236111111111111 | 21.024 |
| 0.7243055555555555 | 21.024 |
| 0.725 | 21.024 |
| 0.7256944444444445 | 21.024 |
| 0.7263888888888889 | 21.024 |
| 0.7270833333333333 | 21.024 |
| 0.7277777777777777 | 21.024 |
| 0.7284722222222223 | 21.024 |
| 0.7291666666666666 | 21.024 |
| 0.7298611111111111 | 21.024 |
| 0.7305555555555556 | 21.024 |
| 0.7312500000000001 | 21.024 |
| 0.7319444444444444 | 21.024 |
| 0.7326388888888888 | 25.419 |
| 0.7333333333333334 | 25.419 |
| 0.7340277777777778 | 25.419 |
| 0.7347222222222222 | 29.823 |
| 0.7354166666666666 | 25.419 |
| 0.7361111111111112 | 25.419 |
| 0.7368055555555556 | 25.419 |
| 0.7374999999999999 | 25.419 |
| 0.7381944444444444 | 25.419 |
| 0.7388888888888889 | 25.419 |
| 0.7395833333333334 | 21.024 |
| 0.7402777777777777 | 21.024 |
| 0.7409722222222223 | 21.024 |
| 0.7416666666666667 | 21.024 |
| 0.7423611111111111 | 21.024 |
| 0.7430555555555555 | 25.419 |
| 0.74375 | 25.419 |
| 0.7444444444444445 | 25.419 |
| 0.7451388888888889 | 25.419 |
| 0.7458333333333332 | 25.419 |
| 0.7465277777777778 | 25.419 |
| 0.7472222222222222 | 25.419 |
| 0.7479166666666667 | 29.823 |
| 0.748611111111111 | 29.823 |
| 0.7493055555555556 | 25.419 |
| 0.75 | 25.419 |
| 0.7506944444444444 | 21.024 |
| 0.751388888888889 | 21.024 |
| 0.7520833333333333 | 16.636 |
| 0.7527777777777778 | 16.636 |
| 0.7534722222222222 | 16.636 |
| 0.7541666666666668 | 16.636 |
| 0.7548611111111111 | 12.257 |
| 0.7555555555555555 | 12.257 |
| 0.75625 | 12.257 |
| 0.7569444444444445 | 12.257 |
| 0.7576388888888889 | 12.257 |
| 0.7583333333333333 | 12.257 |
| 0.7590277777777777 | 12.257 |
| 0.7597222222222223 | 7.887 |
| 0.7604166666666666 | 12.257 |
| 0.7611111111111111 | 7.887 |
| 0.7618055555555556 | 12.257 |
| 0.7625000000000001 | 12.257 |
| 0.7631944444444444 | 12.257 |
| 0.7638888888888888 | 12.257 |
| 0.7645833333333334 | 12.257 |
| 0.7652777777777778 | 7.887 |
| 0.7659722222222222 | 7.887 |
| 0.7666666666666666 | 7.887 |
| 0.7673611111111112 | 7.887 |
| 0.7680555555555556 | 7.887 |
| 0.7687499999999999 | 3.525 |
| 0.7694444444444444 | 3.525 |
| 0.7701388888888889 | 3.525 |
| 0.7708333333333334 | 3.525 |
| 0.7715277777777777 | 3.525 |
| 0.7722222222222223 | 3.525 |
| 0.7729166666666667 | 0 |
| 0.7736111111111111 | 0 |
| 0.7743055555555555 | 0 |
| 0.775 | 0 |
| 0.7756944444444445 | 0 |
| 0.7763888888888889 | 0 |
| 0.7770833333333332 | 0 |
| 0.7777777777777778 | 0 |
| 0.7784722222222222 | 0 |
| 0.7791666666666667 | 0 |
| 0.779861111111111 | 0 |
| 0.7805555555555556 | 3.525 |
| 0.78125 | 0 |
| 0.7819444444444444 | 3.525 |
| 0.782638888888889 | 3.525 |
| 0.7833333333333333 | 3.525 |
| 0.7840277777777778 | 3.525 |
| 0.7847222222222222 | 3.525 |
| 0.7854166666666668 | 3.525 |
| 0.7861111111111111 | 3.525 |
| 0.7868055555555555 | 0 |
| 0.7875 | 0 |
| 0.7881944444444445 | 0 |
| 0.7888888888888889 | 0 |
| 0.7895833333333333 | 0 |
| 0.7902777777777777 | 0 |
| 0.7909722222222223 | 0 |
| 0.7916666666666666 | 0 |
| 0.7923611111111111 | 0 |
| 0.7930555555555556 | 0 |
| 0.7937500000000001 | 0 |
| 0.7944444444444444 | 0 |
| 0.7951388888888888 | 0 |
| 0.7958333333333334 | 0 |
| 0.7965277777777778 | 0 |
| 0.7972222222222222 | 0 |
| 0.7979166666666666 | 0 |
| 0.7986111111111112 | 0 |
| 0.7993055555555556 | 0 |
| 0.7999999999999999 | 0 |
| 0.8006944444444444 | 0 |
| 0.8013888888888889 | 0 |
| 0.8020833333333334 | 0 |
| 0.8027777777777777 | 0 |
| 0.8034722222222223 | 0 |
| 0.8041666666666667 | 0 |
| 0.8048611111111111 | 0 |
| 0.8055555555555555 | 0 |
| 0.80625 | 0 |
| 0.8069444444444445 | 0 |
| 0.8076388888888889 | 0 |
| 0.8083333333333332 | 0 |
| 0.8090277777777778 | 0 |
| 0.8097222222222222 | 0 |
| 0.8104166666666667 | 0 |
| 0.811111111111111 | 0 |
| 0.8118055555555556 | 0 |
| 0.8125 | 0 |
| 0.8131944444444444 | 0 |
| 0.813888888888889 | 0 |
| 0.8145833333333333 | 0 |
| 0.8152777777777778 | 0 |
| 0.8159722222222222 | 0 |
| 0.8166666666666668 | 0 |
| 0.8173611111111111 | 0 |
| 0.8180555555555555 | 0 |
| 0.81875 | 0 |
| 0.8194444444444445 | 0 |
| 0.8201388888888889 | 0 |
| 0.8208333333333333 | 0 |
| 0.8215277777777777 | 0 |
| 0.8222222222222223 | 0 |
| 0.8229166666666666 | 0 |
| 0.8236111111111111 | 0 |
| 0.8243055555555556 | 0 |
| 0.8250000000000001 | 0 |
| 0.8256944444444444 | 0 |
| 0.8263888888888888 | 0 |
| 0.8270833333333334 | 0 |
| 0.8277777777777778 | 0 |
| 0.8284722222222222 | 0 |
| 0.8291666666666666 | 0 |
| 0.8298611111111112 | 0 |
| 0.8305555555555556 | 0 |
| 0.8312499999999999 | 0 |
| 0.8319444444444444 | 0 |
| 0.8326388888888889 | 0 |
| 0.8333333333333334 | 0 |
| 0.8340277777777777 | 0 |
| 0.8347222222222223 | 0 |
| 0.8354166666666667 | 0 |
| 0.8361111111111111 | 0 |
| 0.8368055555555555 | 0 |
| 0.8375 | 0 |
| 0.8381944444444445 | 0 |
| 0.8388888888888889 | 0 |
| 0.8395833333333332 | 0 |
| 0.8402777777777778 | 0 |
| 0.8409722222222222 | 0 |
| 0.8416666666666667 | 0 |
| 0.842361111111111 | 0 |
| 0.8430555555555556 | 0 |
| 0.84375 | 0 |
| 0.8444444444444444 | 0 |
| 0.845138888888889 | 0 |
| 0.8458333333333333 | 0 |
| 0.8465277777777778 | 0 |
| 0.8472222222222222 | 0 |
| 0.8479166666666668 | 0 |
| 0.8486111111111111 | 0 |
| 0.8493055555555555 | 0 |
| 0.85 | 0 |
| 0.8506944444444445 | 0 |
| 0.8513888888888889 | 0 |
| 0.8520833333333333 | 0 |
| 0.8527777777777777 | 0 |
| 0.8534722222222223 | 0 |
| 0.8541666666666666 | 0 |
| 0.8548611111111111 | 0 |
| 0.8555555555555556 | 0 |
| 0.8562500000000001 | 0 |
| 0.8569444444444444 | 0 |
| 0.8576388888888888 | 0 |
| 0.8583333333333334 | 0 |
| 0.8590277777777778 | 0 |
| 0.8597222222222222 | 0 |
| 0.8604166666666666 | 0 |
| 0.8611111111111112 | 0 |
| 0.8618055555555556 | 0 |
| 0.8624999999999999 | 0 |
| 0.8631944444444444 | 0 |
| 0.8638888888888889 | 0 |
| 0.8645833333333334 | 0 |
| 0.8652777777777777 | 0 |
| 0.8659722222222223 | 0 |
| 0.8666666666666667 | 0 |
| 0.8673611111111111 | 0 |
| 0.8680555555555555 | 0 |
| 0.86875 | 0 |
| 0.8694444444444445 | 0 |
| 0.8701388888888889 | 0 |
| 0.8708333333333332 | 0 |
| 0.8715277777777778 | 0 |
| 0.8722222222222222 | 0 |
| 0.8729166666666667 | 0 |
| 0.873611111111111 | 0 |
| 0.8743055555555556 | 0 |
| 0.875 | 0 |
| 0.8756944444444444 | 0 |
| 0.876388888888889 | 0 |
| 0.8770833333333333 | 0 |
| 0.8777777777777778 | 0 |
| 0.8784722222222222 | 0 |
| 0.8791666666666668 | 0 |
| 0.8798611111111111 | 0 |
| 0.8805555555555555 | 0 |
| 0.88125 | 0 |
| 0.8819444444444445 | 0 |
| 0.8826388888888889 | 0 |
| 0.8833333333333333 | 0 |
| 0.8840277777777777 | 0 |
| 0.8847222222222223 | 0 |
| 0.8854166666666666 | 0 |
| 0.8861111111111111 | 0 |
| 0.8868055555555556 | 0 |
| 0.8875000000000001 | 0 |
| 0.8881944444444444 | 0 |
| 0.8888888888888888 | 0 |
| 0.8895833333333334 | 0 |
| 0.8902777777777778 | 0 |
| 0.8909722222222222 | 0 |
| 0.8916666666666666 | 0 |
| 0.8923611111111112 | 0 |
| 0.8930555555555556 | 0 |
| 0.8937499999999999 | 0 |
| 0.8944444444444444 | 0 |
| 0.8951388888888889 | 0 |
| 0.8958333333333334 | 0 |
| 0.8965277777777777 | 0 |
| 0.8972222222222223 | 0 |
| 0.8979166666666667 | 0 |
| 0.8986111111111111 | 0 |
| 0.8993055555555555 | 0 |
| 0.9 | 0 |
| 0.9006944444444445 | 0 |
| 0.9013888888888889 | 0 |
| 0.9020833333333332 | 0 |
| 0.9027777777777778 | 0 |
| 0.9034722222222222 | 0 |
| 0.9041666666666667 | 0 |
| 0.904861111111111 | 0 |
| 0.9055555555555556 | 0 |
| 0.90625 | 0 |
| 0.9069444444444444 | 0 |
| 0.907638888888889 | 0 |
| 0.9083333333333333 | 0 |
| 0.9090277777777778 | 0 |
| 0.9097222222222222 | 0 |
| 0.9104166666666668 | 0 |
| 0.9111111111111111 | 0 |
| 0.9118055555555555 | 0 |
| 0.9125 | 0 |
| 0.9131944444444445 | 0 |
| 0.9138888888888889 | 0 |
| 0.9145833333333333 | 0 |
| 0.9152777777777777 | 0 |
| 0.9159722222222223 | 0 |
| 0.9166666666666666 | 0 |
| 0.9173611111111111 | 0 |
| 0.9180555555555556 | 0 |
| 0.9187500000000001 | 0 |
| 0.9194444444444444 | 0 |
| 0.9201388888888888 | 0 |
| 0.9208333333333334 | 0 |
| 0.9215277777777778 | 0 |
| 0.9222222222222222 | 0 |
| 0.9229166666666666 | 0 |
| 0.9236111111111112 | 0 |
| 0.9243055555555556 | 0 |
| 0.9249999999999999 | 0 |
| 0.9256944444444444 | 0 |
| 0.9263888888888889 | 0 |
| 0.9270833333333334 | 0 |
| 0.9277777777777777 | 0 |
| 0.9284722222222223 | 0 |
| 0.9291666666666667 | 0 |
| 0.9298611111111111 | 0 |
| 0.9305555555555555 | 0 |
| 0.93125 | 0 |
| 0.9319444444444445 | 0 |
| 0.9326388888888889 | 0 |
| 0.9333333333333332 | 0 |
| 0.9340277777777778 | 0 |
| 0.9347222222222222 | 0 |
| 0.9354166666666667 | 0 |
| 0.936111111111111 | 0 |
| 0.9368055555555556 | 0 |
| 0.9375 | 0 |
| 0.9381944444444444 | 0 |
| 0.938888888888889 | 0 |
| 0.9395833333333333 | 0 |
| 0.9402777777777778 | 0 |
| 0.9409722222222222 | 0 |
| 0.9416666666666668 | 0 |
| 0.9423611111111111 | 0 |
| 0.9430555555555555 | 0 |
| 0.94375 | 0 |
| 0.9444444444444445 | 0 |
| 0.9451388888888889 | 0 |
| 0.9458333333333333 | 0 |
| 0.9465277777777777 | 0 |
| 0.9472222222222223 | 0 |
| 0.9479166666666666 | 0 |
| 0.9486111111111111 | 0 |
| 0.9493055555555556 | 0 |
| 0.9500000000000001 | 0 |
| 0.9506944444444444 | 0 |
| 0.9513888888888888 | 0 |
| 0.9520833333333334 | 0 |
| 0.9527777777777778 | 0 |
| 0.9534722222222222 | 0 |
| 0.9541666666666666 | 0 |
| 0.9548611111111112 | 0 |
| 0.9555555555555556 | 0 |
| 0.9562499999999999 | 0 |
| 0.9569444444444444 | 0 |
| 0.9576388888888889 | 0 |
| 0.9583333333333334 | 0 |
| 0.9590277777777777 | 0 |
| 0.9597222222222223 | 0 |
| 0.9604166666666667 | 0 |
| 0.9611111111111111 | 0 |
| 0.9618055555555555 | 0 |
| 0.9625 | 0 |
| 0.9631944444444445 | 0 |
| 0.9638888888888889 | 0 |
| 0.9645833333333332 | 0 |
| 0.9652777777777778 | 0 |
| 0.9659722222222222 | 0 |
| 0.9666666666666667 | 0 |
| 0.967361111111111 | 0 |
| 0.9680555555555556 | 0 |
| 0.96875 | 0 |
| 0.9694444444444444 | 0 |
| 0.970138888888889 | 0 |
| 0.9708333333333333 | 0 |
| 0.9715277777777778 | 0 |
| 0.9722222222222222 | 0 |
| 0.9729166666666668 | 0 |
| 0.9736111111111111 | 0 |
| 0.9743055555555555 | 0 |
| 0.975 | 0 |
| 0.9756944444444445 | 0 |
| 0.9763888888888889 | 0 |
| 0.9770833333333333 | 0 |
| 0.9777777777777777 | 0 |
| 0.9784722222222223 | 0 |
| 0.9791666666666666 | 0 |
| 0.9798611111111111 | 0 |
| 0.9805555555555556 | 0 |
| 0.9812500000000001 | 0 |
| 0.9819444444444444 | 0 |
| 0.9826388888888888 | 0 |
| 0.9833333333333334 | 0 |
| 0.9840277777777778 | 0 |
| 0.9847222222222222 | 0 |
| 0.9854166666666666 | 0 |
| 0.9861111111111112 | 0 |
| 0.9868055555555556 | 0 |
| 0.9874999999999999 | 0 |
| 0.9881944444444444 | 0 |
| 0.9888888888888889 | 0 |
| 0.9895833333333334 | 0 |
| 0.9902777777777777 | 0 |
| 0.9909722222222223 | 0 |
| 0.9916666666666667 | 0 |
| 0.9923611111111111 | 0 |
| 0.9930555555555555 | 0 |
| 0.99375 | 0 |
| 0.9944444444444445 | 0 |
| 0.9951388888888889 | 0 |
| 0.9958333333333332 | 0 |
| 0.9965277777777778 | 0 |
| 0.9972222222222222 | 0 |
| 0.9979166666666667 | 0 |
| 0.998611111111111 | 0 |
| 0.9993055555555556 | 0 |